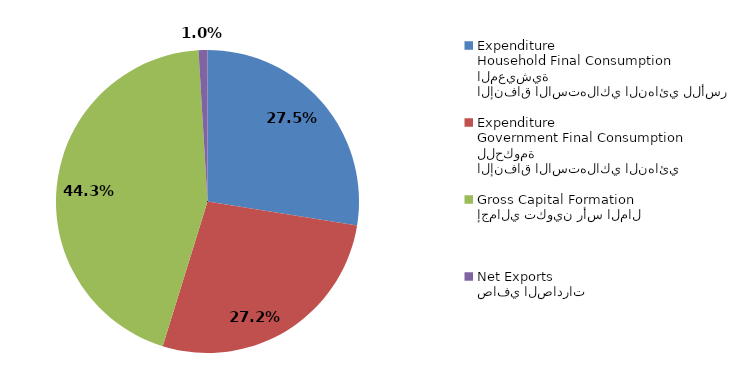
| Category | Series 0 |
|---|---|
| الإنفاق الاستهلاكي النهائي للأسر المعيشية
Household Final Consumption Expenditure | 32102.335 |
| الإنفاق الاستهلاكي النهائي للحكومة
Government Final Consumption Expenditure | 31770.441 |
| إجمالي تكوين رأس المال
Gross Capital Formation  | 51610.566 |
| صافي الصادرات
Net Exports  | 1108 |